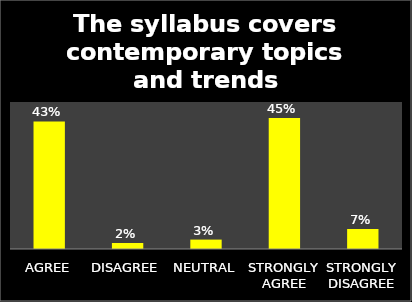
| Category | Series 0 |
|---|---|
| AGREE | 0.434 |
| DISAGREE | 0.02 |
| NEUTRAL | 0.032 |
| STRONGLY AGREE | 0.446 |
| STRONGLY DISAGREE | 0.068 |